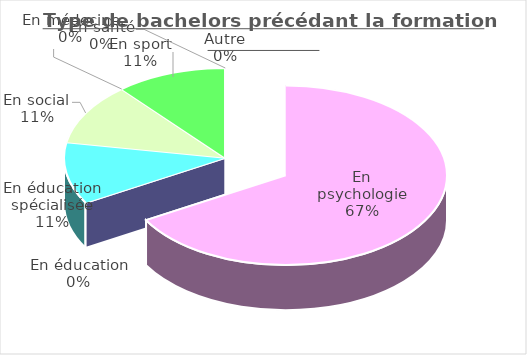
| Category | Series 0 |
|---|---|
| En santé | 0 |
| En psychologie | 6 |
| En éducation | 0 |
| En éducation spécialisée | 1 |
| En social | 1 |
| En médecine | 0 |
| En sport | 1 |
| Autre | 0 |